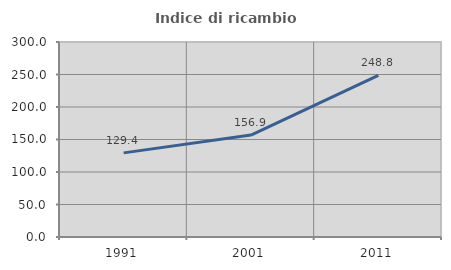
| Category | Indice di ricambio occupazionale  |
|---|---|
| 1991.0 | 129.412 |
| 2001.0 | 156.863 |
| 2011.0 | 248.78 |